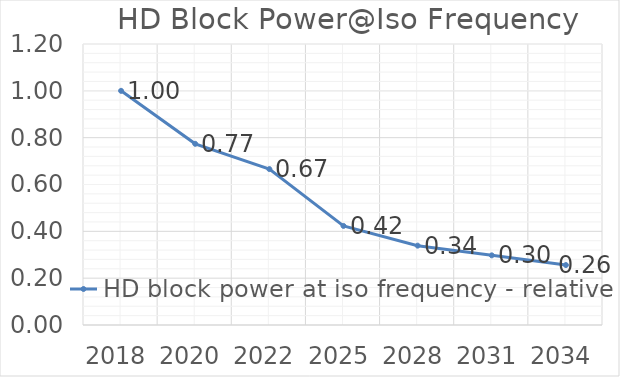
| Category | HD block power at iso frequency - relative |
|---|---|
| 2018.0 | 1 |
| 2020.0 | 0.774 |
| 2022.0 | 0.666 |
| 2025.0 | 0.423 |
| 2028.0 | 0.339 |
| 2031.0 | 0.297 |
| 2034.0 | 0.256 |